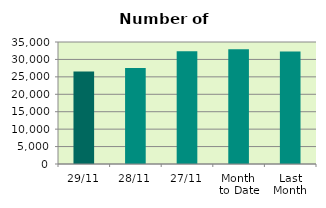
| Category | Series 0 |
|---|---|
| 29/11 | 26508 |
| 28/11 | 27574 |
| 27/11 | 32318 |
| Month 
to Date | 32932.667 |
| Last
Month | 32305.043 |